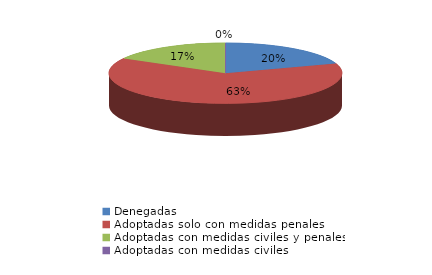
| Category | Series 0 |
|---|---|
| Denegadas | 54 |
| Adoptadas solo con medidas penales | 173 |
| Adoptadas con medidas civiles y penales | 46 |
| Adoptadas con medidas civiles | 0 |